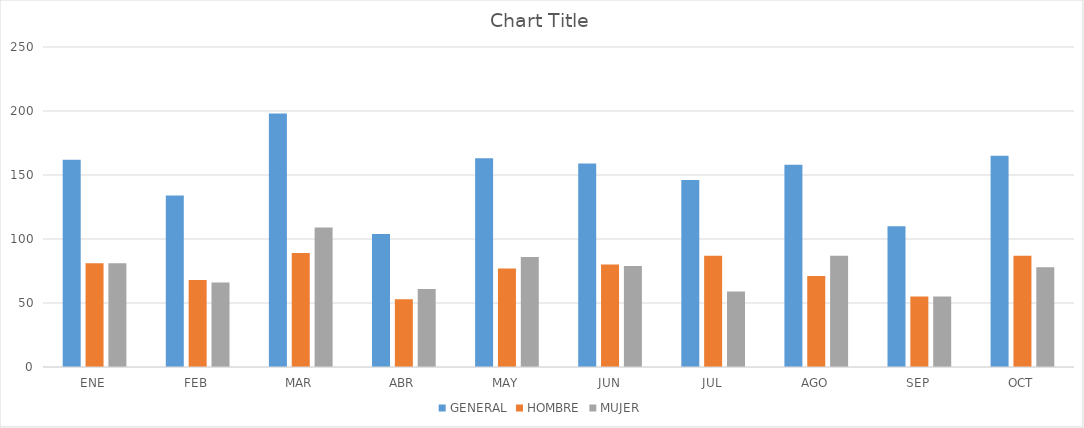
| Category | GENERAL | HOMBRE | MUJER |
|---|---|---|---|
| ENE | 162 | 81 | 81 |
| FEB | 134 | 68 | 66 |
| MAR | 198 | 89 | 109 |
| ABR | 104 | 53 | 61 |
| MAY | 163 | 77 | 86 |
| JUN | 159 | 80 | 79 |
| JUL | 146 | 87 | 59 |
| AGO | 158 | 71 | 87 |
| SEP | 110 | 55 | 55 |
| OCT | 165 | 87 | 78 |